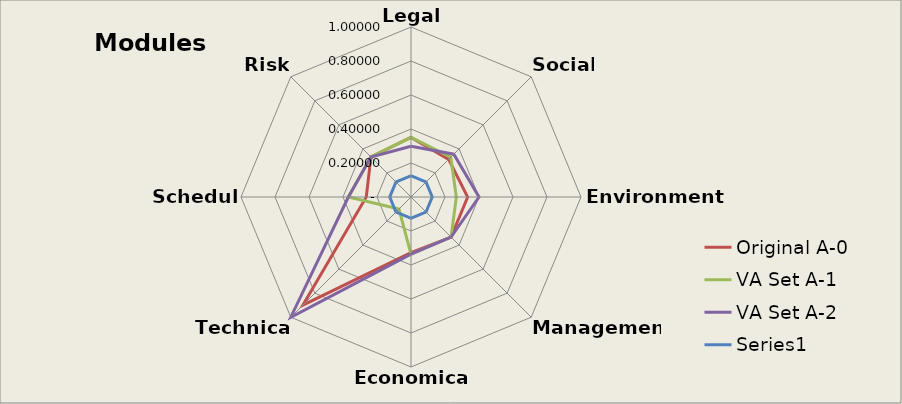
| Category | Original A-0 | VA Set A-1 | VA Set A-2 | Series 0 |
|---|---|---|---|---|
| Legal | 0.351 | 0.351 | 0.298 | 0.125 |
| Social | 0.313 | 0.331 | 0.356 | 0.125 |
| Environmental | 0.333 | 0.267 | 0.4 | 0.125 |
| Management | 0.333 | 0.333 | 0.333 | 0.125 |
| Economical | 0.328 | 0.336 | 0.336 | 0.125 |
| Technical | 0.9 | 0.1 | 1 | 0.125 |
| Schedule | 0.263 | 0.368 | 0.368 | 0.125 |
| Risk | 0.333 | 0.333 | 0.333 | 0.125 |